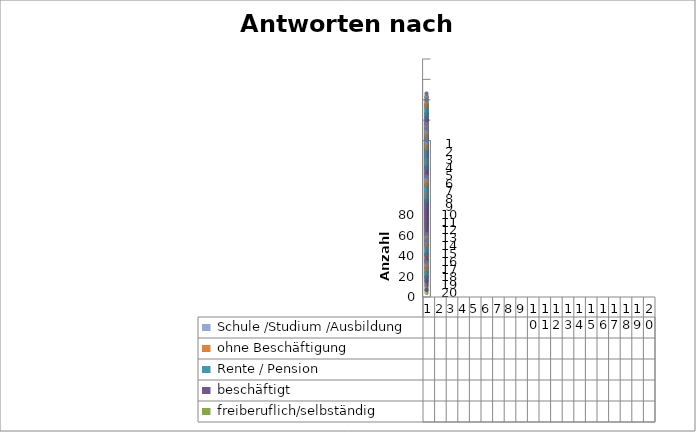
| Category |  freiberuflich/selbständig    |  beschäftigt    |  Rente / Pension    |  ohne Beschäftigung    |  Schule /Studium /Ausbildung    |
|---|---|---|---|---|---|
| 0 | 6 | 24 | 16 | 1 | 3 |
| 1 | 7 | 31 | 6 | 3 | 0 |
| 2 | 3 | 12 | 7 | 1 | 0 |
| 3 | 12 | 38 | 11 | 5 | 1 |
| 4 | 8 | 27 | 11 | 3 | 2 |
| 5 | 5 | 28 | 13 | 4 | 4 |
| 6 | 5 | 21 | 2 | 3 | 0 |
| 7 | 6 | 25 | 19 | 5 | 3 |
| 8 | 5 | 12 | 7 | 3 | 2 |
| 9 | 2 | 9 | 2 | 1 | 1 |
| 10 | 5 | 18 | 14 | 2 | 3 |
| 11 | 5 | 16 | 11 | 3 | 2 |
| 12 | 4 | 10 | 4 | 1 | 0 |
| 13 | 10 | 35 | 4 | 5 | 5 |
| 14 | 9 | 43 | 16 | 4 | 4 |
| 15 | 7 | 13 | 3 | 2 | 2 |
| 16 | 2 | 6 | 2 | 3 | 1 |
| 17 | 5 | 18 | 9 | 3 | 1 |
| 18 | 4 | 3 | 3 | 2 | 1 |
| 19 | 3 | 13 | 8 | 4 | 2 |